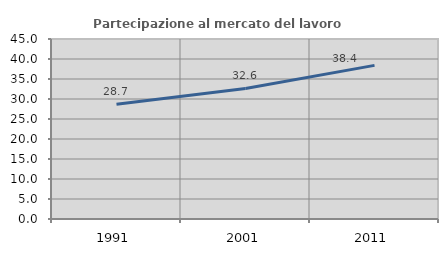
| Category | Partecipazione al mercato del lavoro  femminile |
|---|---|
| 1991.0 | 28.691 |
| 2001.0 | 32.644 |
| 2011.0 | 38.409 |